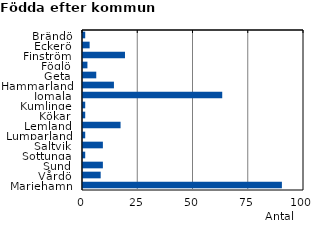
| Category | Series 0 |
|---|---|
| Brändö | 1 |
| Eckerö | 3 |
| Finström | 19 |
| Föglö | 2 |
| Geta | 6 |
| Hammarland | 14 |
| Jomala | 63 |
| Kumlinge | 1 |
| Kökar | 1 |
| Lemland | 17 |
| Lumparland | 1 |
| Saltvik | 9 |
| Sottunga | 1 |
| Sund | 9 |
| Vårdö | 8 |
| Mariehamn | 90 |